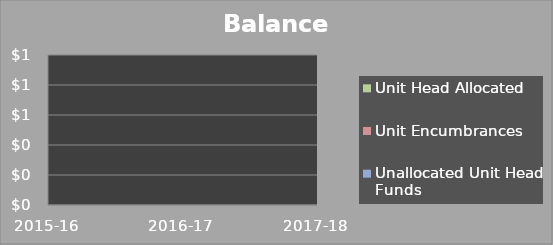
| Category | Unallocated Unit Head Funds | Unit Encumbrances | Unit Head Allocated |
|---|---|---|---|
| 2015-16 | 0 | 0 | 0 |
| 2016-17 | 0 | 0 | 0 |
| 2017-18 | 0 | 0 | 0 |